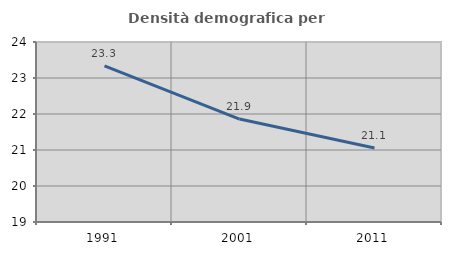
| Category | Densità demografica |
|---|---|
| 1991.0 | 23.335 |
| 2001.0 | 21.86 |
| 2011.0 | 21.054 |